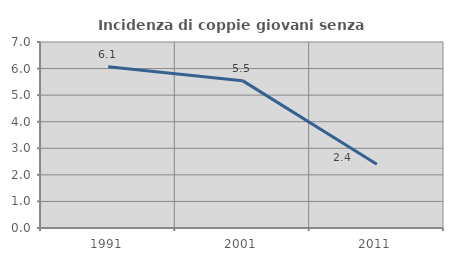
| Category | Incidenza di coppie giovani senza figli |
|---|---|
| 1991.0 | 6.073 |
| 2001.0 | 5.546 |
| 2011.0 | 2.396 |